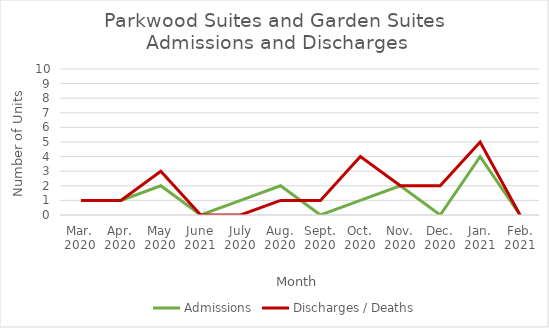
| Category | Admissions | Discharges / Deaths |
|---|---|---|
| Mar.
2020 | 1 | 1 |
| Apr.
2020 | 1 | 1 |
| May
2020 | 2 | 3 |
| June
2021 | 0 | 0 |
| July
2020 | 1 | 0 |
| Aug.
2020 | 2 | 1 |
| Sept.
2020 | 0 | 1 |
| Oct.
2020 | 1 | 4 |
| Nov.
2020 | 2 | 2 |
| Dec.
2020 | 0 | 2 |
| Jan.
2021 | 4 | 5 |
| Feb.
2021 | 0 | 0 |